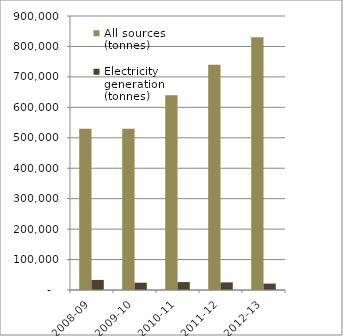
| Category | All sources (tonnes) | Electricity generation (tonnes) |
|---|---|---|
| 2008-09 | 530000 | 33000 |
| 2009-10 | 530000 | 24000 |
| 2010-11 | 640000 | 26000 |
| 2011-12 | 740000 | 25000 |
| 2012-13 | 830000 | 21000 |